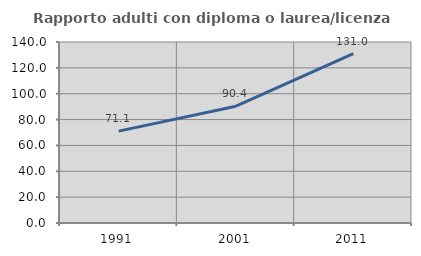
| Category | Rapporto adulti con diploma o laurea/licenza media  |
|---|---|
| 1991.0 | 71.056 |
| 2001.0 | 90.353 |
| 2011.0 | 130.957 |